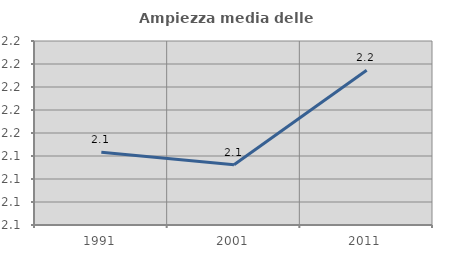
| Category | Ampiezza media delle famiglie |
|---|---|
| 1991.0 | 2.143 |
| 2001.0 | 2.132 |
| 2011.0 | 2.215 |